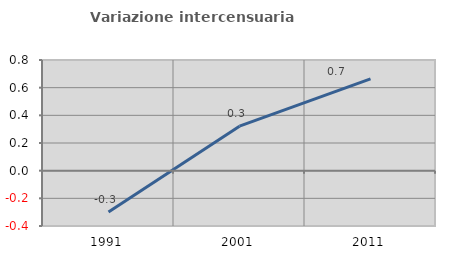
| Category | Variazione intercensuaria annua |
|---|---|
| 1991.0 | -0.299 |
| 2001.0 | 0.321 |
| 2011.0 | 0.664 |